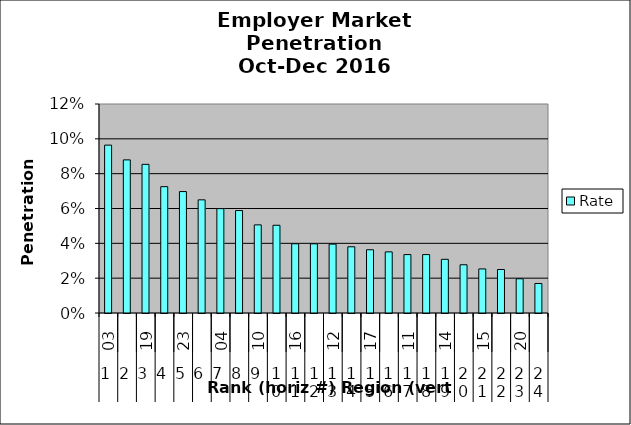
| Category | Rate |
|---|---|
| 0 | 0.096 |
| 1 | 0.088 |
| 2 | 0.085 |
| 3 | 0.073 |
| 4 | 0.07 |
| 5 | 0.065 |
| 6 | 0.06 |
| 7 | 0.059 |
| 8 | 0.051 |
| 9 | 0.05 |
| 10 | 0.04 |
| 11 | 0.04 |
| 12 | 0.04 |
| 13 | 0.038 |
| 14 | 0.036 |
| 15 | 0.035 |
| 16 | 0.034 |
| 17 | 0.034 |
| 18 | 0.031 |
| 19 | 0.028 |
| 20 | 0.025 |
| 21 | 0.025 |
| 22 | 0.02 |
| 23 | 0.017 |